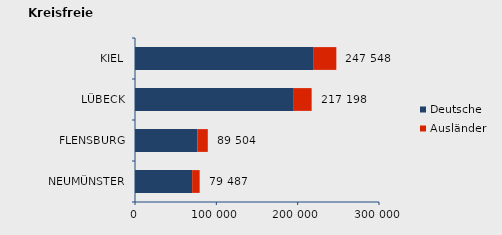
| Category | Deutsche | Ausländer | Series 2 |
|---|---|---|---|
| NEUMÜNSTER | 70271 | 9216 | 79487 |
| FLENSBURG | 76802 | 12702 | 89504 |
| LÜBECK | 195214 | 21984 | 217198 |
| KIEL | 218984 | 28564 | 247548 |